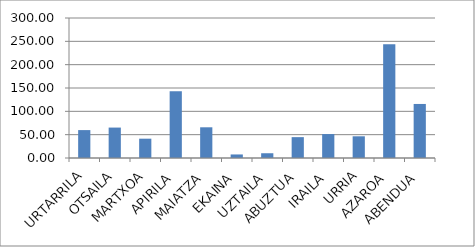
| Category | Series 0 |
|---|---|
| URTARRILA | 59.8 |
| OTSAILA | 65.2 |
| MARTXOA | 41.4 |
| APIRILA | 142.8 |
| MAIATZA | 65.8 |
| EKAINA | 7.6 |
| UZTAILA | 10.2 |
| ABUZTUA | 44.7 |
| IRAILA | 51.3 |
| URRIA | 46.5 |
| AZAROA | 243.6 |
| ABENDUA | 115.8 |